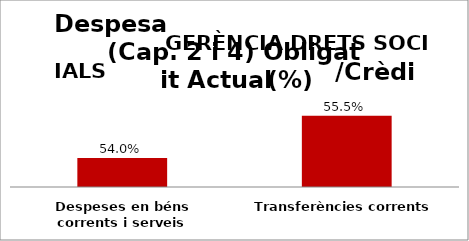
| Category | Series 0 |
|---|---|
| Despeses en béns corrents i serveis | 0.54 |
| Transferències corrents | 0.555 |